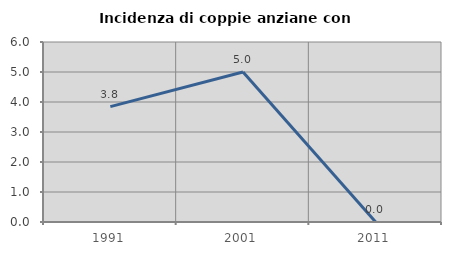
| Category | Incidenza di coppie anziane con figli |
|---|---|
| 1991.0 | 3.846 |
| 2001.0 | 5 |
| 2011.0 | 0 |